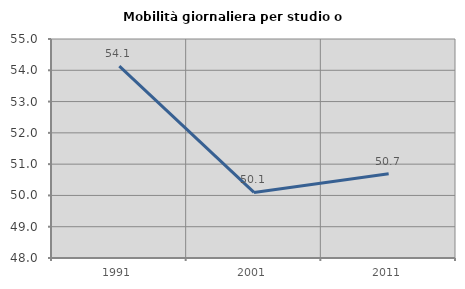
| Category | Mobilità giornaliera per studio o lavoro |
|---|---|
| 1991.0 | 54.13 |
| 2001.0 | 50.097 |
| 2011.0 | 50.691 |